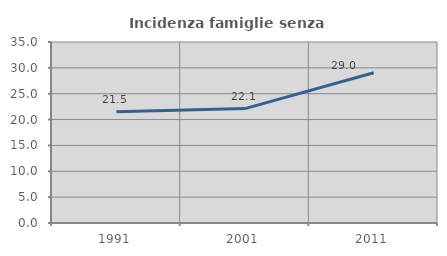
| Category | Incidenza famiglie senza nuclei |
|---|---|
| 1991.0 | 21.534 |
| 2001.0 | 22.119 |
| 2011.0 | 29.05 |